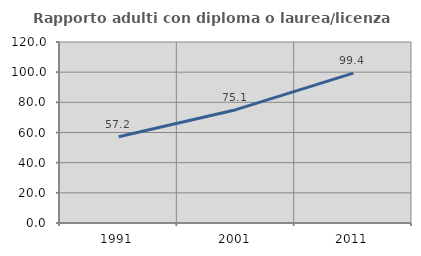
| Category | Rapporto adulti con diploma o laurea/licenza media  |
|---|---|
| 1991.0 | 57.195 |
| 2001.0 | 75.129 |
| 2011.0 | 99.351 |